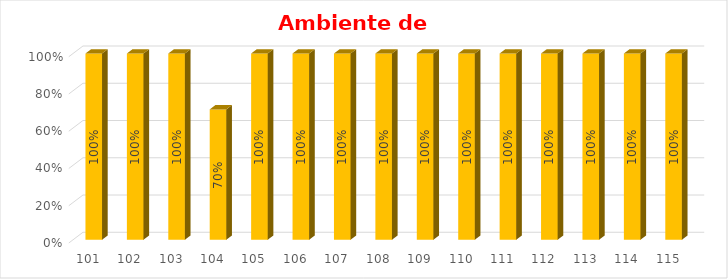
| Category | % Avance |
|---|---|
| 101.0 | 1 |
| 102.0 | 1 |
| 103.0 | 1 |
| 104.0 | 0.7 |
| 105.0 | 1 |
| 106.0 | 1 |
| 107.0 | 1 |
| 108.0 | 1 |
| 109.0 | 1 |
| 110.0 | 1 |
| 111.0 | 1 |
| 112.0 | 1 |
| 113.0 | 1 |
| 114.0 | 1 |
| 115.0 | 1 |